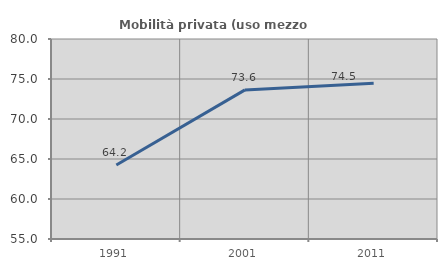
| Category | Mobilità privata (uso mezzo privato) |
|---|---|
| 1991.0 | 64.246 |
| 2001.0 | 73.635 |
| 2011.0 | 74.466 |